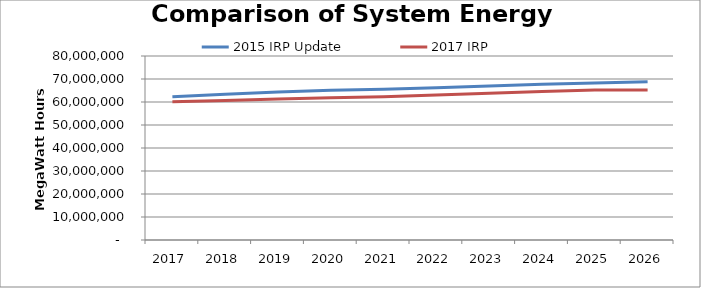
| Category | 2015 IRP Update | 2017 IRP |
|---|---|---|
| 2017.0 | 62269100 | 60061400 |
| 2018.0 | 63382060 | 60670450 |
| 2019.0 | 64382220 | 61301370 |
| 2020.0 | 65083290 | 61863300 |
| 2021.0 | 65573070 | 62297200 |
| 2022.0 | 66238110 | 63007030 |
| 2023.0 | 66904220 | 63799730 |
| 2024.0 | 67760860 | 64610360 |
| 2025.0 | 68236690 | 65171560 |
| 2026.0 | 68857140 | 65182980 |